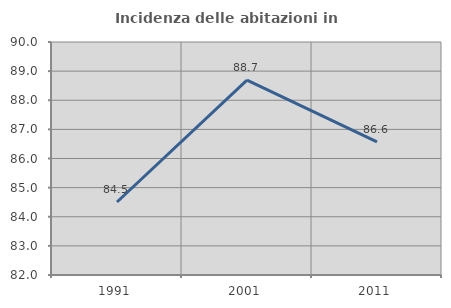
| Category | Incidenza delle abitazioni in proprietà  |
|---|---|
| 1991.0 | 84.507 |
| 2001.0 | 88.69 |
| 2011.0 | 86.574 |